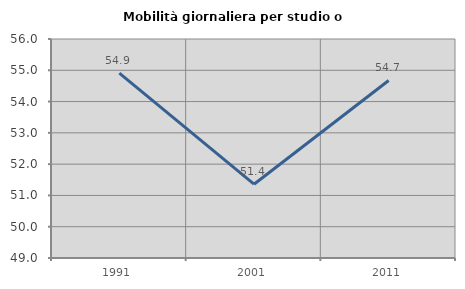
| Category | Mobilità giornaliera per studio o lavoro |
|---|---|
| 1991.0 | 54.909 |
| 2001.0 | 51.359 |
| 2011.0 | 54.675 |